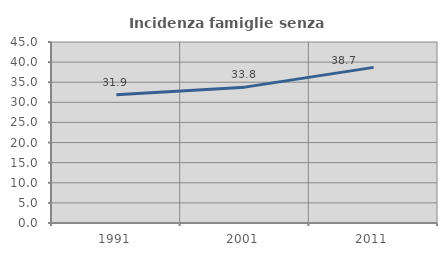
| Category | Incidenza famiglie senza nuclei |
|---|---|
| 1991.0 | 31.906 |
| 2001.0 | 33.779 |
| 2011.0 | 38.69 |